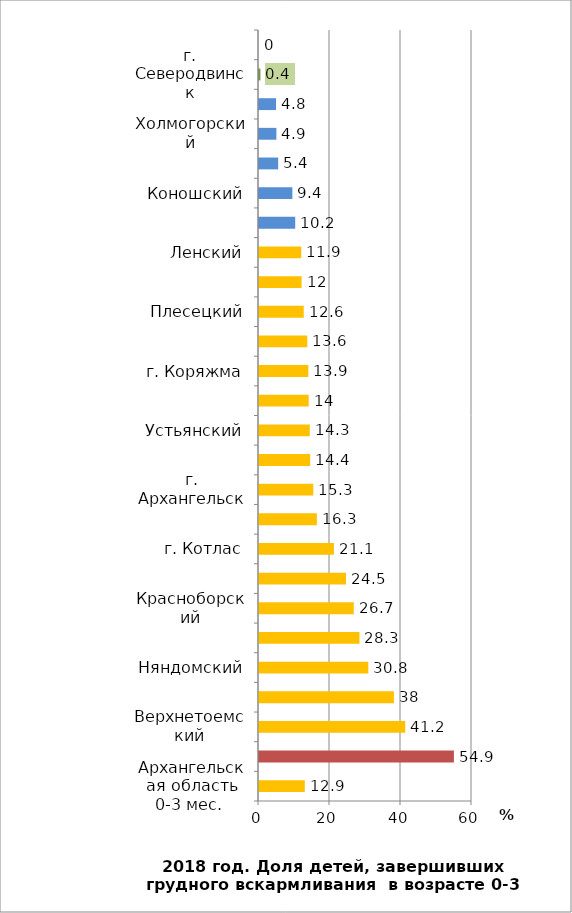
| Category | Series 0 |
|---|---|
| Архангельская область 0-3 мес.  | 12.9 |
| Мезенский | 54.9 |
| Верхнетоемский | 41.2 |
| Виноградовский | 38 |
| Няндомский | 30.8 |
| Вилегодский | 28.3 |
| Красноборский | 26.7 |
| Областные организации | 24.5 |
| г. Котлас | 21.1 |
| Лешуконский | 16.3 |
| г. Архангельск | 15.3 |
| г. Новодвинск | 14.4 |
| Устьянский | 14.3 |
| г. Мирный | 14 |
| г. Коряжма | 13.9 |
| Онежский | 13.6 |
| Плесецкий | 12.6 |
| Шенкурский | 12 |
| Ленский | 11.9 |
| Каргопольский | 10.2 |
| Коношский | 9.4 |
| Вельский | 5.4 |
| Холмогорский | 4.9 |
| Приморский | 4.8 |
| г. Северодвинск | 0.4 |
| Пинежский | 0 |